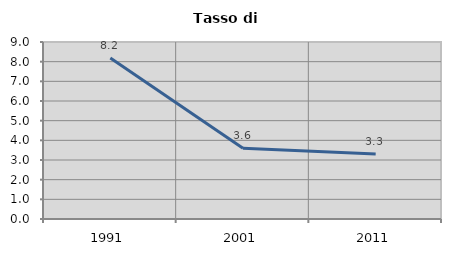
| Category | Tasso di disoccupazione   |
|---|---|
| 1991.0 | 8.191 |
| 2001.0 | 3.595 |
| 2011.0 | 3.3 |